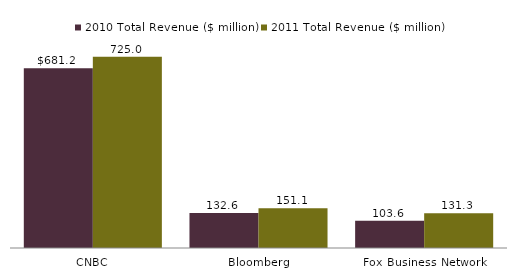
| Category | 2010 Total Revenue ($ million) | 2011 Total Revenue ($ million) |
|---|---|---|
| CNBC | 681.2 | 725 |
| Bloomberg | 132.6 | 151.1 |
| Fox Business Network | 103.6 | 131.3 |